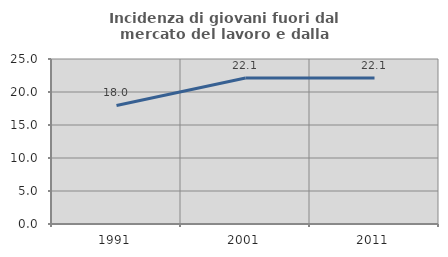
| Category | Incidenza di giovani fuori dal mercato del lavoro e dalla formazione  |
|---|---|
| 1991.0 | 17.962 |
| 2001.0 | 22.132 |
| 2011.0 | 22.124 |